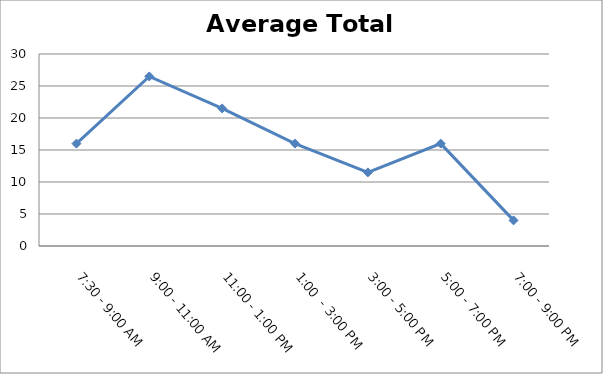
| Category | Total |
|---|---|
| 7:30 - 9:00 AM | 16 |
| 9:00 - 11:00 AM | 26.5 |
| 11:00 - 1:00 PM | 21.5 |
| 1:00  - 3:00 PM | 16 |
| 3:00 - 5:00 PM | 11.5 |
| 5:00 - 7:00 PM | 16 |
| 7:00 - 9:00 PM | 4 |